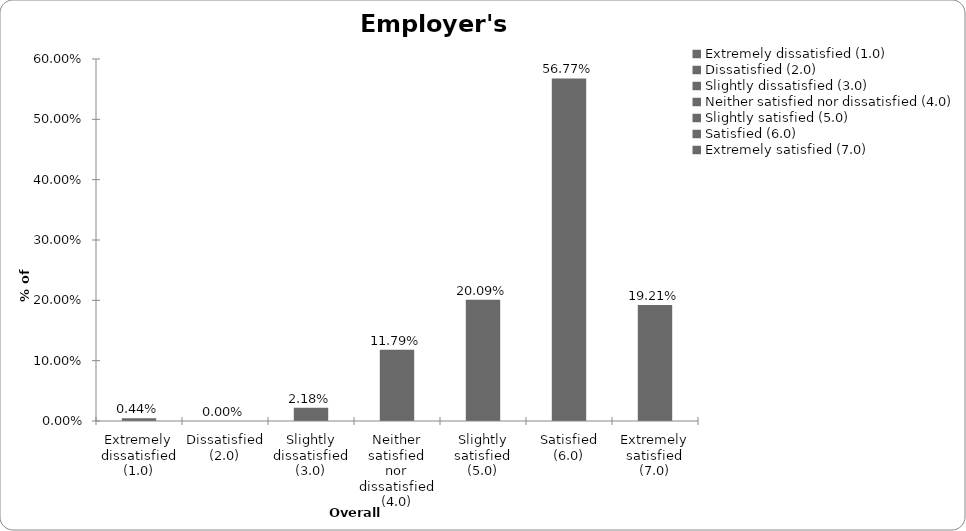
| Category | Employer's liability |
|---|---|
| Extremely dissatisfied (1.0) | 0.004 |
| Dissatisfied (2.0) | 0 |
| Slightly dissatisfied (3.0) | 0.022 |
| Neither satisfied nor dissatisfied (4.0) | 0.118 |
| Slightly satisfied (5.0) | 0.201 |
| Satisfied (6.0) | 0.568 |
| Extremely satisfied (7.0) | 0.192 |